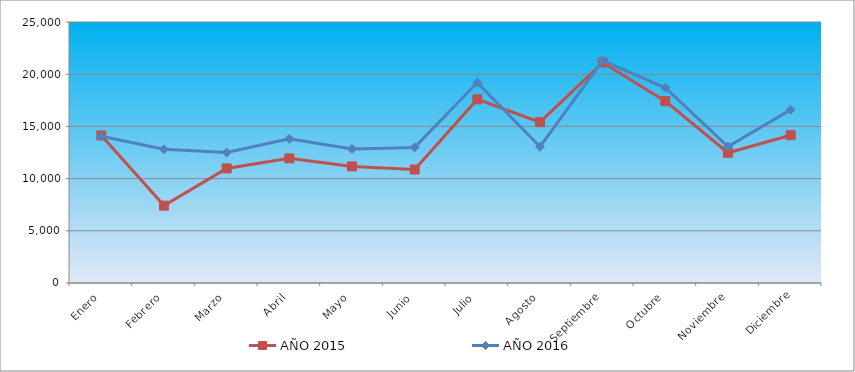
| Category | AÑO 2015 | AÑO 2016 |
|---|---|---|
| Enero | 14136.698 | 14057.813 |
| Febrero | 7411.749 | 12813.679 |
| Marzo | 10975.99 | 12497.668 |
| Abril | 11942.405 | 13815.819 |
| Mayo | 11166.673 | 12840.15 |
| Junio | 10865.948 | 12988.569 |
| Julio | 17594.484 | 19199.568 |
| Agosto | 15401.316 | 13051.877 |
| Septiembre | 21117.035 | 21310.953 |
| Octubre | 17413.627 | 18699.517 |
| Noviembre | 12473.254 | 13063.604 |
| Diciembre | 14158.293 | 16600.441 |